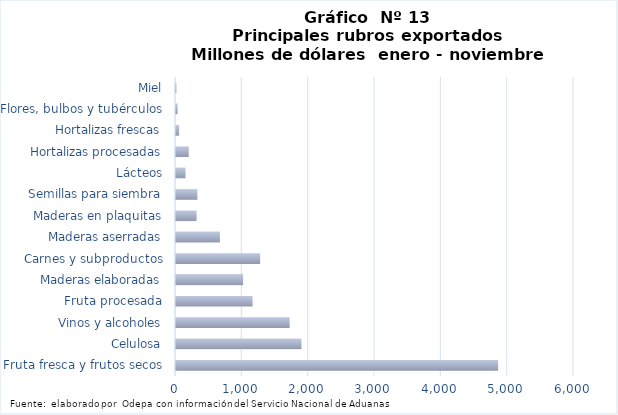
| Category | Series 7 |
|---|---|
| Fruta fresca y frutos secos | 4856405.896 |
| Celulosa | 1891475.088 |
| Vinos y alcoholes | 1713103.716 |
| Fruta procesada | 1154135.277 |
| Maderas elaboradas | 1011708.771 |
| Carnes y subproductos | 1268448.732 |
| Maderas aserradas | 661851.214 |
| Maderas en plaquitas | 310375.157 |
| Semillas para siembra | 322262.363 |
| Lácteos | 143361.029 |
| Hortalizas procesadas | 192528.385 |
| Hortalizas frescas | 47422.308 |
| Flores, bulbos y tubérculos | 24050.949 |
| Miel | 6092.87 |